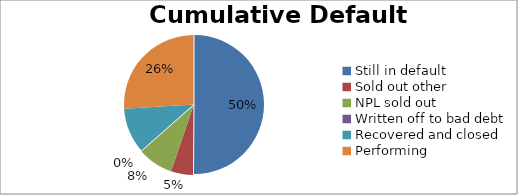
| Category | Cumulative Default Breakdown |
|---|---|
| Still in default | 0.501 |
| Sold out other | 0.051 |
| NPL sold out | 0.082 |
| Written off to bad debt | 0 |
| Recovered and closed | 0.106 |
| Performing | 0.26 |